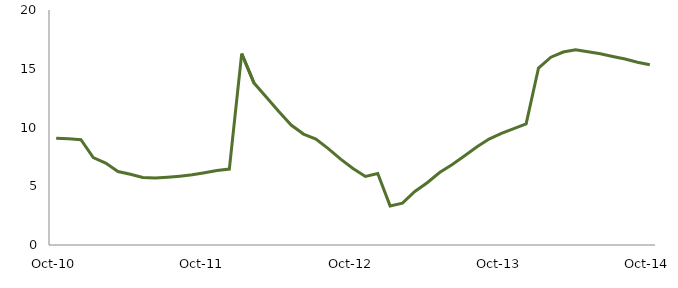
| Category | Series 0 |
|---|---|
| Oct-10 | 9.094 |
|  | 9.033 |
|  | 8.965 |
|  | 7.441 |
|  | 6.973 |
|  | 6.256 |
|  | 6.015 |
|  | 5.748 |
|  | 5.693 |
|  | 5.764 |
|  | 5.857 |
|  | 5.972 |
| Oct-11 | 6.145 |
|  | 6.336 |
|  | 6.461 |
|  | 16.287 |
|  | 13.779 |
|  | 12.581 |
|  | 11.354 |
|  | 10.206 |
|  | 9.442 |
|  | 9.023 |
|  | 8.202 |
|  | 7.302 |
| Oct-12 | 6.505 |
|  | 5.832 |
|  | 6.087 |
|  | 3.328 |
|  | 3.566 |
|  | 4.552 |
|  | 5.302 |
|  | 6.165 |
|  | 6.838 |
|  | 7.569 |
|  | 8.335 |
|  | 9.014 |
| Oct-13 | 9.5 |
|  | 9.898 |
|  | 10.31 |
|  | 15.062 |
|  | 15.983 |
|  | 16.424 |
|  | 16.607 |
|  | 16.44 |
|  | 16.277 |
|  | 16.048 |
|  | 15.834 |
|  | 15.556 |
| Oct-14 | 15.334 |